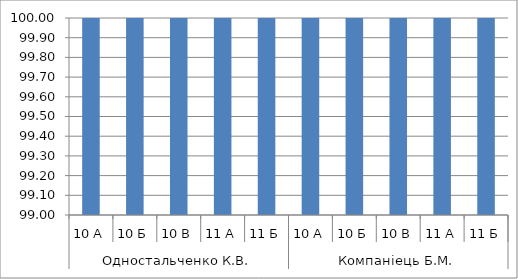
| Category | Series 0 |
|---|---|
| 0 | 100 |
| 1 | 100 |
| 2 | 100 |
| 3 | 100 |
| 4 | 100 |
| 5 | 100 |
| 6 | 100 |
| 7 | 100 |
| 8 | 100 |
| 9 | 100 |